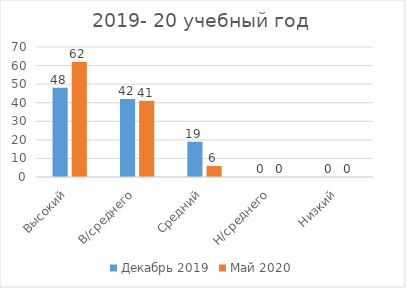
| Category | Декабрь 2019 | Май 2020 |
|---|---|---|
| Высокий | 48 | 62 |
| В/среднего | 42 | 41 |
| Средний | 19 | 6 |
| Н/среднего | 0 | 0 |
| Низкий | 0 | 0 |